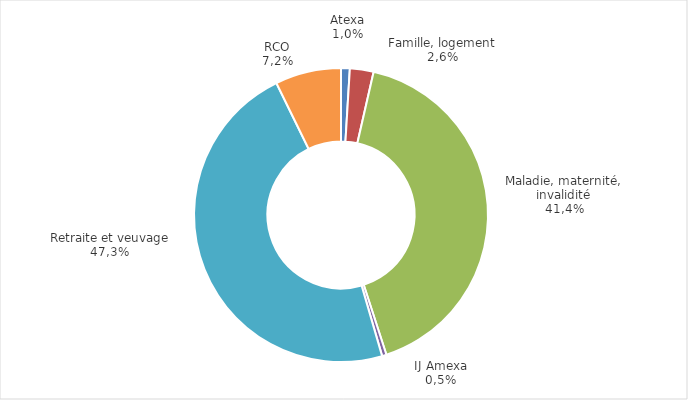
| Category | Series 0 |
|---|---|
| Atexa | 135.685 |
| Famille, logement | 367.686 |
| Maladie, maternité, invalidité | 5842.777 |
| IJ Amexa | 68.135 |
| Retraite et veuvage | 6665.924 |
| Retraite complémentaire obligatoire (RCO) | 1021.99 |